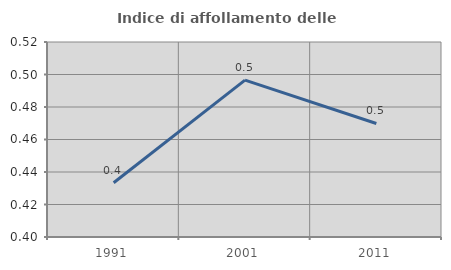
| Category | Indice di affollamento delle abitazioni  |
|---|---|
| 1991.0 | 0.433 |
| 2001.0 | 0.497 |
| 2011.0 | 0.47 |